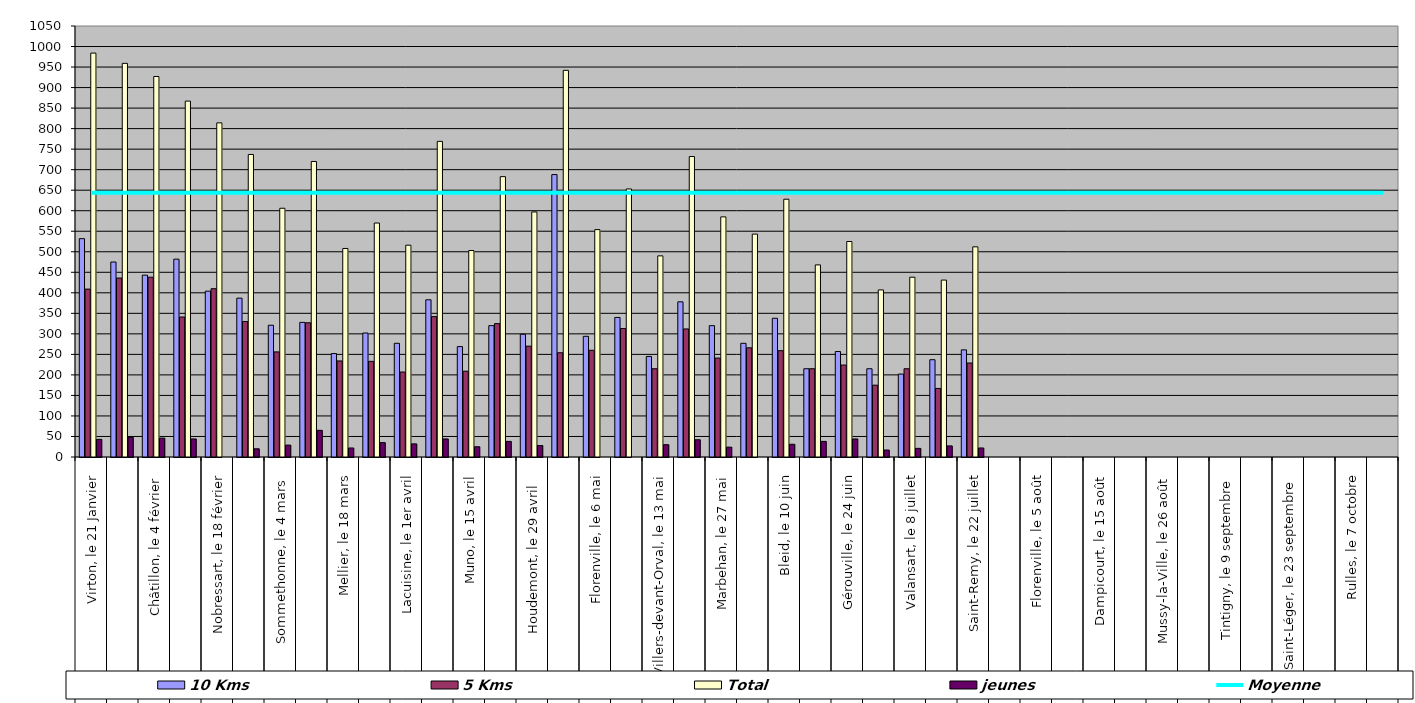
| Category | 10 Kms | 5 Kms | Total | jeunes |
|---|---|---|---|---|
| 0 | 532 | 409 | 984 | 43 |
| 1 | 475 | 436 | 959 | 48 |
| 2 | 443 | 438 | 927 | 46 |
| 3 | 482 | 341 | 867 | 44 |
| 4 | 404 | 410 | 814 | 0 |
| 5 | 387 | 330 | 737 | 20 |
| 6 | 321 | 256 | 606 | 29 |
| 7 | 328 | 327 | 720 | 65 |
| 8 | 252 | 234 | 508 | 22 |
| 9 | 302 | 233 | 570 | 35 |
| 10 | 277 | 207 | 516 | 32 |
| 11 | 383 | 342 | 769 | 44 |
| 12 | 269 | 209 | 503 | 25 |
| 13 | 320 | 325 | 683 | 38 |
| 14 | 299 | 270 | 597 | 28 |
| 15 | 688 | 254 | 942 | 0 |
| 16 | 294 | 260 | 554 | 0 |
| 17 | 340 | 313 | 653 | 0 |
| 18 | 245 | 215 | 490 | 30 |
| 19 | 378 | 312 | 732 | 42 |
| 20 | 320 | 241 | 585 | 24 |
| 21 | 277 | 266 | 543 | 0 |
| 22 | 338 | 259 | 628 | 31 |
| 23 | 215 | 215 | 468 | 38 |
| 24 | 257 | 224 | 525 | 44 |
| 25 | 215 | 175 | 407 | 17 |
| 26 | 202 | 215 | 438 | 21 |
| 27 | 237 | 167 | 431 | 27 |
| 28 | 261 | 229 | 512 | 22 |
| 29 | 0 | 0 | 0 | 0 |
| 30 | 0 | 0 | 0 | 0 |
| 31 | 0 | 0 | 0 | 0 |
| 32 | 0 | 0 | 0 | 0 |
| 33 | 0 | 0 | 0 | 0 |
| 34 | 0 | 0 | 0 | 0 |
| 35 | 0 | 0 | 0 | 0 |
| 36 | 0 | 0 | 0 | 0 |
| 37 | 0 | 0 | 0 | 0 |
| 38 | 0 | 0 | 0 | 0 |
| 39 | 0 | 0 | 0 | 0 |
| 40 | 0 | 0 | 0 | 0 |
| 41 | 0 | 0 | 0 | 0 |